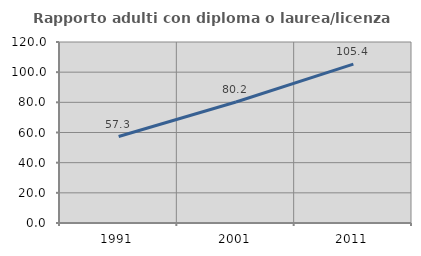
| Category | Rapporto adulti con diploma o laurea/licenza media  |
|---|---|
| 1991.0 | 57.346 |
| 2001.0 | 80.229 |
| 2011.0 | 105.356 |